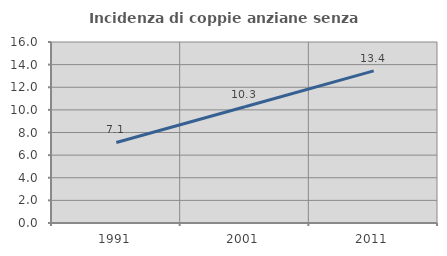
| Category | Incidenza di coppie anziane senza figli  |
|---|---|
| 1991.0 | 7.121 |
| 2001.0 | 10.272 |
| 2011.0 | 13.45 |